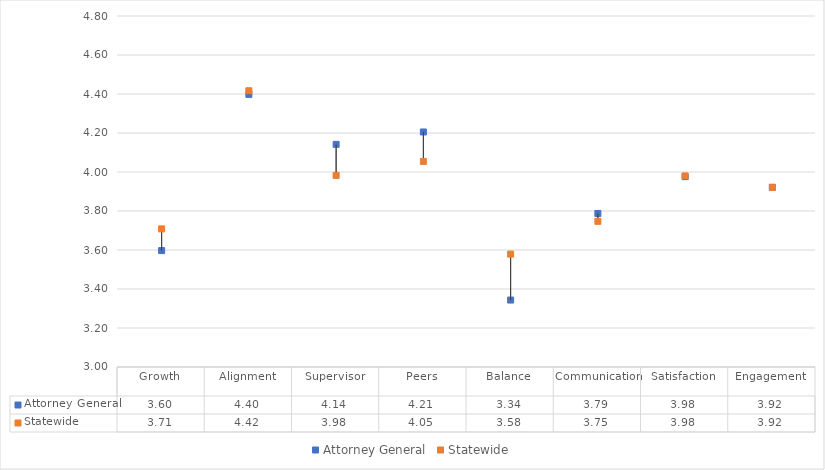
| Category | Attorney General | Statewide |
|---|---|---|
| Growth | 3.597 | 3.708 |
| Alignment | 4.398 | 4.417 |
| Supervisor | 4.142 | 3.983 |
| Peers | 4.205 | 4.054 |
| Balance | 3.343 | 3.579 |
| Communication | 3.787 | 3.747 |
| Satisfaction | 3.976 | 3.98 |
| Engagement | 3.921 | 3.921 |